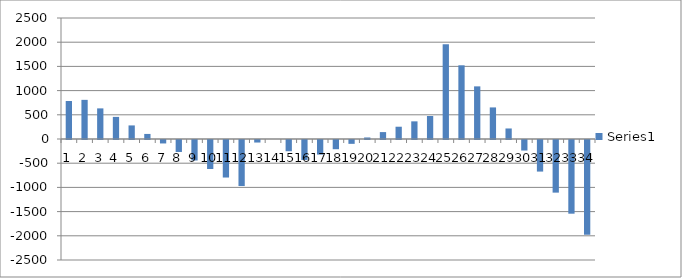
| Category | Series 0 |
|---|---|
| 0 | 784.667 |
| 1 | 808.667 |
| 2 | 632.667 |
| 3 | 456.667 |
| 4 | 280.667 |
| 5 | 104.667 |
| 6 | -71.333 |
| 7 | -247.333 |
| 8 | -423.333 |
| 9 | -599.333 |
| 10 | -775.333 |
| 11 | -951.333 |
| 12 | -52.364 |
| 13 | 0 |
| 14 | -232.364 |
| 15 | -412.364 |
| 16 | -301.364 |
| 17 | -190.364 |
| 18 | -79.364 |
| 19 | 31.636 |
| 20 | 142.636 |
| 21 | 253.636 |
| 22 | 364.636 |
| 23 | 475.636 |
| 24 | 1957.5 |
| 25 | 1522.5 |
| 26 | 1087.5 |
| 27 | 652.5 |
| 28 | 217.5 |
| 29 | -217.5 |
| 30 | -652.5 |
| 31 | -1087.5 |
| 32 | -1522.5 |
| 33 | -1957.5 |